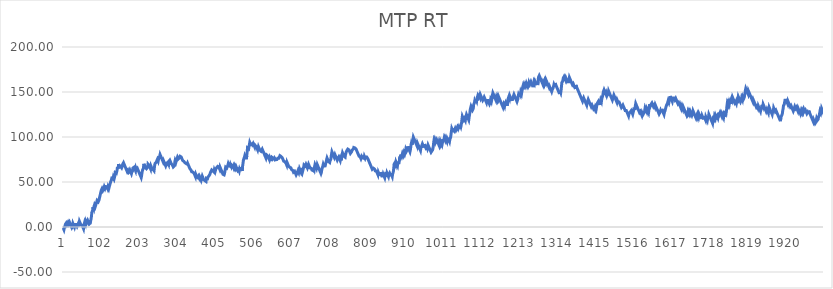
| Category | MTP RT |
|---|---|
| 0 | -1 |
| 1 | -2 |
| 2 | -3 |
| 3 | -1.1 |
| 4 | -2.1 |
| 5 | 1.43 |
| 6 | 3.15 |
| 7 | 2.15 |
| 8 | 4.4 |
| 9 | 3.4 |
| 10 | 2.4 |
| 11 | 1.4 |
| 12 | 3.46 |
| 13 | 5.176 |
| 14 | 4.176 |
| 15 | 3.176 |
| 16 | 2.176 |
| 17 | 5.216 |
| 18 | 4.216 |
| 19 | 3.216 |
| 20 | 2.216 |
| 21 | 1.216 |
| 22 | 0.216 |
| 23 | -0.784 |
| 24 | -1.784 |
| 25 | 0.616 |
| 26 | 3.756 |
| 27 | 2.756 |
| 28 | 1.756 |
| 29 | 0.756 |
| 30 | -0.244 |
| 31 | 1.386 |
| 32 | 2.816 |
| 33 | 1.816 |
| 34 | 3.756 |
| 35 | 2.756 |
| 36 | 1.756 |
| 37 | 0.756 |
| 38 | -0.244 |
| 39 | 2.696 |
| 40 | 1.696 |
| 41 | 0.696 |
| 42 | 4.126 |
| 43 | 6.376 |
| 44 | 5.376 |
| 45 | 4.376 |
| 46 | 3.376 |
| 47 | 2.376 |
| 48 | 1.376 |
| 49 | 3.046 |
| 50 | 2.046 |
| 51 | 1.046 |
| 52 | 0.046 |
| 53 | -0.954 |
| 54 | -1.954 |
| 55 | 0.936 |
| 56 | 3.676 |
| 57 | 5.326 |
| 58 | 4.326 |
| 59 | 3.326 |
| 60 | 6.266 |
| 61 | 5.266 |
| 62 | 4.266 |
| 63 | 3.266 |
| 64 | 4.656 |
| 65 | 7.256 |
| 66 | 6.256 |
| 67 | 5.256 |
| 68 | 4.256 |
| 69 | 3.256 |
| 70 | 3.666 |
| 71 | 2.666 |
| 72 | 4.336 |
| 73 | 6.986 |
| 74 | 9.186 |
| 75 | 11.876 |
| 76 | 16.186 |
| 77 | 15.186 |
| 78 | 18.326 |
| 79 | 22.146 |
| 80 | 21.146 |
| 81 | 20.146 |
| 82 | 23.186 |
| 83 | 24.516 |
| 84 | 23.516 |
| 85 | 22.516 |
| 86 | 23.576 |
| 87 | 25.246 |
| 88 | 26.426 |
| 89 | 25.426 |
| 90 | 29.446 |
| 91 | 30.006 |
| 92 | 29.006 |
| 93 | 28.006 |
| 94 | 27.006 |
| 95 | 29.946 |
| 96 | 31.786 |
| 97 | 32.426 |
| 98 | 35.366 |
| 99 | 36.036 |
| 100 | 35.036 |
| 101 | 40.716 |
| 102 | 39.716 |
| 103 | 42.556 |
| 104 | 41.556 |
| 105 | 40.556 |
| 106 | 39.556 |
| 107 | 41.226 |
| 108 | 43.186 |
| 109 | 44.656 |
| 110 | 43.656 |
| 111 | 42.656 |
| 112 | 41.656 |
| 113 | 44.886 |
| 114 | 43.886 |
| 115 | 45.786 |
| 116 | 44.786 |
| 117 | 43.786 |
| 118 | 42.786 |
| 119 | 44.666 |
| 120 | 43.666 |
| 121 | 42.666 |
| 122 | 41.666 |
| 123 | 45.786 |
| 124 | 44.786 |
| 125 | 46.416 |
| 126 | 50.236 |
| 127 | 51.196 |
| 128 | 52.466 |
| 129 | 54.096 |
| 130 | 53.096 |
| 131 | 54.326 |
| 132 | 53.326 |
| 133 | 55.336 |
| 134 | 54.336 |
| 135 | 53.336 |
| 136 | 55.026 |
| 137 | 56.716 |
| 138 | 60.436 |
| 139 | 59.436 |
| 140 | 60.636 |
| 141 | 59.636 |
| 142 | 58.636 |
| 143 | 63.246 |
| 144 | 66.776 |
| 145 | 65.776 |
| 146 | 64.776 |
| 147 | 69.876 |
| 148 | 68.876 |
| 149 | 67.876 |
| 150 | 66.876 |
| 151 | 68.346 |
| 152 | 67.346 |
| 153 | 67.646 |
| 154 | 66.646 |
| 155 | 65.646 |
| 156 | 66.766 |
| 157 | 67.846 |
| 158 | 69.856 |
| 159 | 68.856 |
| 160 | 71.406 |
| 161 | 70.406 |
| 162 | 69.406 |
| 163 | 68.406 |
| 164 | 67.406 |
| 165 | 66.406 |
| 166 | 65.406 |
| 167 | 64.406 |
| 168 | 63.406 |
| 169 | 62.406 |
| 170 | 61.406 |
| 171 | 60.406 |
| 172 | 62.906 |
| 173 | 61.906 |
| 174 | 60.906 |
| 175 | 59.906 |
| 176 | 62.066 |
| 177 | 63.226 |
| 178 | 62.226 |
| 179 | 61.226 |
| 180 | 60.226 |
| 181 | 59.226 |
| 182 | 60.856 |
| 183 | 61.156 |
| 184 | 62.126 |
| 185 | 65.556 |
| 186 | 64.556 |
| 187 | 65.636 |
| 188 | 66.436 |
| 189 | 65.436 |
| 190 | 64.436 |
| 191 | 63.436 |
| 192 | 62.436 |
| 193 | 65.576 |
| 194 | 64.576 |
| 195 | 63.576 |
| 196 | 62.576 |
| 197 | 64.876 |
| 198 | 63.876 |
| 199 | 62.876 |
| 200 | 61.876 |
| 201 | 60.876 |
| 202 | 59.876 |
| 203 | 58.876 |
| 204 | 57.876 |
| 205 | 56.876 |
| 206 | 55.876 |
| 207 | 54.876 |
| 208 | 56.836 |
| 209 | 60.066 |
| 210 | 62.176 |
| 211 | 63.606 |
| 212 | 62.606 |
| 213 | 65.256 |
| 214 | 70.156 |
| 215 | 69.156 |
| 216 | 68.156 |
| 217 | 67.156 |
| 218 | 66.156 |
| 219 | 66.806 |
| 220 | 65.806 |
| 221 | 64.806 |
| 222 | 63.806 |
| 223 | 64.416 |
| 224 | 66.476 |
| 225 | 69.906 |
| 226 | 68.906 |
| 227 | 69.406 |
| 228 | 68.406 |
| 229 | 67.406 |
| 230 | 66.406 |
| 231 | 65.406 |
| 232 | 64.406 |
| 233 | 67.546 |
| 234 | 66.546 |
| 235 | 65.546 |
| 236 | 64.546 |
| 237 | 65.206 |
| 238 | 64.206 |
| 239 | 63.206 |
| 240 | 63.556 |
| 241 | 62.556 |
| 242 | 66.086 |
| 243 | 69.316 |
| 244 | 70.786 |
| 245 | 71.406 |
| 246 | 70.406 |
| 247 | 72.096 |
| 248 | 72.566 |
| 249 | 71.566 |
| 250 | 75.196 |
| 251 | 74.196 |
| 252 | 73.196 |
| 253 | 72.196 |
| 254 | 77.296 |
| 255 | 76.296 |
| 256 | 78.596 |
| 257 | 80.516 |
| 258 | 79.516 |
| 259 | 78.516 |
| 260 | 77.516 |
| 261 | 76.516 |
| 262 | 75.516 |
| 263 | 74.516 |
| 264 | 73.516 |
| 265 | 72.516 |
| 266 | 73.866 |
| 267 | 72.866 |
| 268 | 71.866 |
| 269 | 70.866 |
| 270 | 69.866 |
| 271 | 68.866 |
| 272 | 67.866 |
| 273 | 69.026 |
| 274 | 72.456 |
| 275 | 71.456 |
| 276 | 70.456 |
| 277 | 69.456 |
| 278 | 71.706 |
| 279 | 70.706 |
| 280 | 69.706 |
| 281 | 72.936 |
| 282 | 73.296 |
| 283 | 74.136 |
| 284 | 73.136 |
| 285 | 72.136 |
| 286 | 71.136 |
| 287 | 70.136 |
| 288 | 69.136 |
| 289 | 69.656 |
| 290 | 68.656 |
| 291 | 67.656 |
| 292 | 66.656 |
| 293 | 65.656 |
| 294 | 66.856 |
| 295 | 67.776 |
| 296 | 71.986 |
| 297 | 73.946 |
| 298 | 72.946 |
| 299 | 71.946 |
| 300 | 70.946 |
| 301 | 74.966 |
| 302 | 73.966 |
| 303 | 77.396 |
| 304 | 76.396 |
| 305 | 75.396 |
| 306 | 74.396 |
| 307 | 74.896 |
| 308 | 76.636 |
| 309 | 77.636 |
| 310 | 78.616 |
| 311 | 77.616 |
| 312 | 78.906 |
| 313 | 77.906 |
| 314 | 76.906 |
| 315 | 75.906 |
| 316 | 74.906 |
| 317 | 73.906 |
| 318 | 72.906 |
| 319 | 73.966 |
| 320 | 72.966 |
| 321 | 71.966 |
| 322 | 72.446 |
| 323 | 71.446 |
| 324 | 72.526 |
| 325 | 71.526 |
| 326 | 70.526 |
| 327 | 69.526 |
| 328 | 70.796 |
| 329 | 69.796 |
| 330 | 70.956 |
| 331 | 69.956 |
| 332 | 68.956 |
| 333 | 67.956 |
| 334 | 66.956 |
| 335 | 65.956 |
| 336 | 64.956 |
| 337 | 63.956 |
| 338 | 64.336 |
| 339 | 63.336 |
| 340 | 62.336 |
| 341 | 61.336 |
| 342 | 60.336 |
| 343 | 62.056 |
| 344 | 61.056 |
| 345 | 61.846 |
| 346 | 60.846 |
| 347 | 59.846 |
| 348 | 58.846 |
| 349 | 57.846 |
| 350 | 56.846 |
| 351 | 55.846 |
| 352 | 58.396 |
| 353 | 57.396 |
| 354 | 56.396 |
| 355 | 55.396 |
| 356 | 56.026 |
| 357 | 55.026 |
| 358 | 54.026 |
| 359 | 56.526 |
| 360 | 55.526 |
| 361 | 54.526 |
| 362 | 55.876 |
| 363 | 54.876 |
| 364 | 53.876 |
| 365 | 52.876 |
| 366 | 51.876 |
| 367 | 52.216 |
| 368 | 51.216 |
| 369 | 56.506 |
| 370 | 55.506 |
| 371 | 54.506 |
| 372 | 53.506 |
| 373 | 52.506 |
| 374 | 53.466 |
| 375 | 52.466 |
| 376 | 51.466 |
| 377 | 50.466 |
| 378 | 51.566 |
| 379 | 50.566 |
| 380 | 54.196 |
| 381 | 53.196 |
| 382 | 54.746 |
| 383 | 53.746 |
| 384 | 55.256 |
| 385 | 54.256 |
| 386 | 56.076 |
| 387 | 57.026 |
| 388 | 56.026 |
| 389 | 58.426 |
| 390 | 59.166 |
| 391 | 60.906 |
| 392 | 61.206 |
| 393 | 60.206 |
| 394 | 63.436 |
| 395 | 64.346 |
| 396 | 63.346 |
| 397 | 62.346 |
| 398 | 61.346 |
| 399 | 62.096 |
| 400 | 61.096 |
| 401 | 63.396 |
| 402 | 62.396 |
| 403 | 61.396 |
| 404 | 62.866 |
| 405 | 64.456 |
| 406 | 63.456 |
| 407 | 65.756 |
| 408 | 66.736 |
| 409 | 65.736 |
| 410 | 67.346 |
| 411 | 66.346 |
| 412 | 67.426 |
| 413 | 66.426 |
| 414 | 65.426 |
| 415 | 64.426 |
| 416 | 66.586 |
| 417 | 65.586 |
| 418 | 64.586 |
| 419 | 63.586 |
| 420 | 62.586 |
| 421 | 61.586 |
| 422 | 60.586 |
| 423 | 59.586 |
| 424 | 58.586 |
| 425 | 57.586 |
| 426 | 58.936 |
| 427 | 57.936 |
| 428 | 59.366 |
| 429 | 58.366 |
| 430 | 59.776 |
| 431 | 66.436 |
| 432 | 67.406 |
| 433 | 66.406 |
| 434 | 65.406 |
| 435 | 64.406 |
| 436 | 65.936 |
| 437 | 68.776 |
| 438 | 70.406 |
| 439 | 69.406 |
| 440 | 68.406 |
| 441 | 69.446 |
| 442 | 68.446 |
| 443 | 67.446 |
| 444 | 69.406 |
| 445 | 68.406 |
| 446 | 67.406 |
| 447 | 69.016 |
| 448 | 68.016 |
| 449 | 68.946 |
| 450 | 67.946 |
| 451 | 66.946 |
| 452 | 65.946 |
| 453 | 67.636 |
| 454 | 66.636 |
| 455 | 65.636 |
| 456 | 67.596 |
| 457 | 66.596 |
| 458 | 65.596 |
| 459 | 66.846 |
| 460 | 65.846 |
| 461 | 64.846 |
| 462 | 63.846 |
| 463 | 62.846 |
| 464 | 61.846 |
| 465 | 64.006 |
| 466 | 63.006 |
| 467 | 62.006 |
| 468 | 64.206 |
| 469 | 63.206 |
| 470 | 62.206 |
| 471 | 66.326 |
| 472 | 65.326 |
| 473 | 64.326 |
| 474 | 63.326 |
| 475 | 62.326 |
| 476 | 67.616 |
| 477 | 70.506 |
| 478 | 73.736 |
| 479 | 75.496 |
| 480 | 74.496 |
| 481 | 77.636 |
| 482 | 79.356 |
| 483 | 78.356 |
| 484 | 77.356 |
| 485 | 76.356 |
| 486 | 75.356 |
| 487 | 79.176 |
| 488 | 82.996 |
| 489 | 87.896 |
| 490 | 86.896 |
| 491 | 87.936 |
| 492 | 86.936 |
| 493 | 89.776 |
| 494 | 91.576 |
| 495 | 93.976 |
| 496 | 92.976 |
| 497 | 91.976 |
| 498 | 90.976 |
| 499 | 89.976 |
| 500 | 93.606 |
| 501 | 92.606 |
| 502 | 91.606 |
| 503 | 90.606 |
| 504 | 93.006 |
| 505 | 92.006 |
| 506 | 91.006 |
| 507 | 90.006 |
| 508 | 89.006 |
| 509 | 90.926 |
| 510 | 91.596 |
| 511 | 90.596 |
| 512 | 89.596 |
| 513 | 88.596 |
| 514 | 87.596 |
| 515 | 86.596 |
| 516 | 85.596 |
| 517 | 86.696 |
| 518 | 89.196 |
| 519 | 88.196 |
| 520 | 87.196 |
| 521 | 86.196 |
| 522 | 85.196 |
| 523 | 86.106 |
| 524 | 85.106 |
| 525 | 84.106 |
| 526 | 83.106 |
| 527 | 83.856 |
| 528 | 86.546 |
| 529 | 85.546 |
| 530 | 84.546 |
| 531 | 83.546 |
| 532 | 82.546 |
| 533 | 81.546 |
| 534 | 80.546 |
| 535 | 79.546 |
| 536 | 78.546 |
| 537 | 77.546 |
| 538 | 76.546 |
| 539 | 77.436 |
| 540 | 80.036 |
| 541 | 80.946 |
| 542 | 79.946 |
| 543 | 78.946 |
| 544 | 77.946 |
| 545 | 76.946 |
| 546 | 75.946 |
| 547 | 74.946 |
| 548 | 76.886 |
| 549 | 75.886 |
| 550 | 74.886 |
| 551 | 73.886 |
| 552 | 75.706 |
| 553 | 74.706 |
| 554 | 77.446 |
| 555 | 76.446 |
| 556 | 77.486 |
| 557 | 76.486 |
| 558 | 77.296 |
| 559 | 76.296 |
| 560 | 75.296 |
| 561 | 76.526 |
| 562 | 75.526 |
| 563 | 75.726 |
| 564 | 74.726 |
| 565 | 75.326 |
| 566 | 74.326 |
| 567 | 74.986 |
| 568 | 73.986 |
| 569 | 76.286 |
| 570 | 75.286 |
| 571 | 75.486 |
| 572 | 76.326 |
| 573 | 75.326 |
| 574 | 77.146 |
| 575 | 79.256 |
| 576 | 78.256 |
| 577 | 79.356 |
| 578 | 78.356 |
| 579 | 77.356 |
| 580 | 78.156 |
| 581 | 77.156 |
| 582 | 76.156 |
| 583 | 75.156 |
| 584 | 74.156 |
| 585 | 73.156 |
| 586 | 72.156 |
| 587 | 73.546 |
| 588 | 72.546 |
| 589 | 71.546 |
| 590 | 71.786 |
| 591 | 70.786 |
| 592 | 69.786 |
| 593 | 68.786 |
| 594 | 71.726 |
| 595 | 70.726 |
| 596 | 69.726 |
| 597 | 68.726 |
| 598 | 67.726 |
| 599 | 68.316 |
| 600 | 67.316 |
| 601 | 66.316 |
| 602 | 65.316 |
| 603 | 66.766 |
| 604 | 65.766 |
| 605 | 64.766 |
| 606 | 63.766 |
| 607 | 62.766 |
| 608 | 63.886 |
| 609 | 62.886 |
| 610 | 61.886 |
| 611 | 60.886 |
| 612 | 61.636 |
| 613 | 60.636 |
| 614 | 61.926 |
| 615 | 60.926 |
| 616 | 59.926 |
| 617 | 58.926 |
| 618 | 57.926 |
| 619 | 56.926 |
| 620 | 58.156 |
| 621 | 60.406 |
| 622 | 59.406 |
| 623 | 62.636 |
| 624 | 61.636 |
| 625 | 60.636 |
| 626 | 59.636 |
| 627 | 64.736 |
| 628 | 63.736 |
| 629 | 62.736 |
| 630 | 61.736 |
| 631 | 60.736 |
| 632 | 61.896 |
| 633 | 60.896 |
| 634 | 59.896 |
| 635 | 60.286 |
| 636 | 63.176 |
| 637 | 62.176 |
| 638 | 66.486 |
| 639 | 68.986 |
| 640 | 67.986 |
| 641 | 68.756 |
| 642 | 67.756 |
| 643 | 66.756 |
| 644 | 69.646 |
| 645 | 68.646 |
| 646 | 67.646 |
| 647 | 66.646 |
| 648 | 65.646 |
| 649 | 64.646 |
| 650 | 68.076 |
| 651 | 69.566 |
| 652 | 68.566 |
| 653 | 67.566 |
| 654 | 66.566 |
| 655 | 65.566 |
| 656 | 64.566 |
| 657 | 66.286 |
| 658 | 65.286 |
| 659 | 64.286 |
| 660 | 63.286 |
| 661 | 62.286 |
| 662 | 63.596 |
| 663 | 62.596 |
| 664 | 65.926 |
| 665 | 64.926 |
| 666 | 63.926 |
| 667 | 67.156 |
| 668 | 69.266 |
| 669 | 68.266 |
| 670 | 67.266 |
| 671 | 66.266 |
| 672 | 65.266 |
| 673 | 64.266 |
| 674 | 69.366 |
| 675 | 68.366 |
| 676 | 67.366 |
| 677 | 66.366 |
| 678 | 65.366 |
| 679 | 64.366 |
| 680 | 63.366 |
| 681 | 62.366 |
| 682 | 61.366 |
| 683 | 60.366 |
| 684 | 59.366 |
| 685 | 60.546 |
| 686 | 63.686 |
| 687 | 64.196 |
| 688 | 66.496 |
| 689 | 67.986 |
| 690 | 69.766 |
| 691 | 68.766 |
| 692 | 67.766 |
| 693 | 66.766 |
| 694 | 68.876 |
| 695 | 67.876 |
| 696 | 66.876 |
| 697 | 71.286 |
| 698 | 72.876 |
| 699 | 75.076 |
| 700 | 76.706 |
| 701 | 75.706 |
| 702 | 74.706 |
| 703 | 73.706 |
| 704 | 72.706 |
| 705 | 71.706 |
| 706 | 72.686 |
| 707 | 71.686 |
| 708 | 73.646 |
| 709 | 72.646 |
| 710 | 75.336 |
| 711 | 78.476 |
| 712 | 81.076 |
| 713 | 83.576 |
| 714 | 82.576 |
| 715 | 81.576 |
| 716 | 80.576 |
| 717 | 79.576 |
| 718 | 78.576 |
| 719 | 77.576 |
| 720 | 79.086 |
| 721 | 80.396 |
| 722 | 79.396 |
| 723 | 78.396 |
| 724 | 77.396 |
| 725 | 76.396 |
| 726 | 75.396 |
| 727 | 74.396 |
| 728 | 73.396 |
| 729 | 76.436 |
| 730 | 75.436 |
| 731 | 77.836 |
| 732 | 76.836 |
| 733 | 75.836 |
| 734 | 74.836 |
| 735 | 73.836 |
| 736 | 76.036 |
| 737 | 75.036 |
| 738 | 74.036 |
| 739 | 79.326 |
| 740 | 80.556 |
| 741 | 82.476 |
| 742 | 81.476 |
| 743 | 80.476 |
| 744 | 79.476 |
| 745 | 78.476 |
| 746 | 77.476 |
| 747 | 78.516 |
| 748 | 77.516 |
| 749 | 80.406 |
| 750 | 81.896 |
| 751 | 83.426 |
| 752 | 83.696 |
| 753 | 85.166 |
| 754 | 84.166 |
| 755 | 86.566 |
| 756 | 85.566 |
| 757 | 86.766 |
| 758 | 85.766 |
| 759 | 84.766 |
| 760 | 83.766 |
| 761 | 82.766 |
| 762 | 81.766 |
| 763 | 80.766 |
| 764 | 82.156 |
| 765 | 83.506 |
| 766 | 84.376 |
| 767 | 85.686 |
| 768 | 86.706 |
| 769 | 85.706 |
| 770 | 86.766 |
| 771 | 88.316 |
| 772 | 87.316 |
| 773 | 88.886 |
| 774 | 87.886 |
| 775 | 88.596 |
| 776 | 87.596 |
| 777 | 86.596 |
| 778 | 85.596 |
| 779 | 84.596 |
| 780 | 83.596 |
| 781 | 82.596 |
| 782 | 81.596 |
| 783 | 80.596 |
| 784 | 79.596 |
| 785 | 78.596 |
| 786 | 77.596 |
| 787 | 78.946 |
| 788 | 77.946 |
| 789 | 76.946 |
| 790 | 75.946 |
| 791 | 77.086 |
| 792 | 78.596 |
| 793 | 77.596 |
| 794 | 77.796 |
| 795 | 76.796 |
| 796 | 75.796 |
| 797 | 77.286 |
| 798 | 76.286 |
| 799 | 78.536 |
| 800 | 77.536 |
| 801 | 76.536 |
| 802 | 77.786 |
| 803 | 76.786 |
| 804 | 78.896 |
| 805 | 77.896 |
| 806 | 76.896 |
| 807 | 77.146 |
| 808 | 76.146 |
| 809 | 75.146 |
| 810 | 74.146 |
| 811 | 73.146 |
| 812 | 72.146 |
| 813 | 71.146 |
| 814 | 70.146 |
| 815 | 69.146 |
| 816 | 68.146 |
| 817 | 67.146 |
| 818 | 66.146 |
| 819 | 65.146 |
| 820 | 64.146 |
| 821 | 63.146 |
| 822 | 64.376 |
| 823 | 65.306 |
| 824 | 66.326 |
| 825 | 65.326 |
| 826 | 64.326 |
| 827 | 63.326 |
| 828 | 62.326 |
| 829 | 61.326 |
| 830 | 63.126 |
| 831 | 62.126 |
| 832 | 61.126 |
| 833 | 60.126 |
| 834 | 59.126 |
| 835 | 58.126 |
| 836 | 60.916 |
| 837 | 59.916 |
| 838 | 58.916 |
| 839 | 57.916 |
| 840 | 56.916 |
| 841 | 60.736 |
| 842 | 59.736 |
| 843 | 58.736 |
| 844 | 57.736 |
| 845 | 56.736 |
| 846 | 57.656 |
| 847 | 57.816 |
| 848 | 56.816 |
| 849 | 58.736 |
| 850 | 57.736 |
| 851 | 56.736 |
| 852 | 55.736 |
| 853 | 54.736 |
| 854 | 57.036 |
| 855 | 58.746 |
| 856 | 57.746 |
| 857 | 58.666 |
| 858 | 57.666 |
| 859 | 60.066 |
| 860 | 59.066 |
| 861 | 58.066 |
| 862 | 57.066 |
| 863 | 56.066 |
| 864 | 58.176 |
| 865 | 57.176 |
| 866 | 59.866 |
| 867 | 58.866 |
| 868 | 57.866 |
| 869 | 56.866 |
| 870 | 58.976 |
| 871 | 57.976 |
| 872 | 56.976 |
| 873 | 55.976 |
| 874 | 58.916 |
| 875 | 57.916 |
| 876 | 61.546 |
| 877 | 65.366 |
| 878 | 69.876 |
| 879 | 68.876 |
| 880 | 71.276 |
| 881 | 70.276 |
| 882 | 69.276 |
| 883 | 72.316 |
| 884 | 71.316 |
| 885 | 70.316 |
| 886 | 69.316 |
| 887 | 68.316 |
| 888 | 71.356 |
| 889 | 70.356 |
| 890 | 72.366 |
| 891 | 71.366 |
| 892 | 73.866 |
| 893 | 78.376 |
| 894 | 77.376 |
| 895 | 76.376 |
| 896 | 80.396 |
| 897 | 79.396 |
| 898 | 78.396 |
| 899 | 77.396 |
| 900 | 81.606 |
| 901 | 80.606 |
| 902 | 79.606 |
| 903 | 78.606 |
| 904 | 82.816 |
| 905 | 81.816 |
| 906 | 80.816 |
| 907 | 79.816 |
| 908 | 83.736 |
| 909 | 86.286 |
| 910 | 85.286 |
| 911 | 84.286 |
| 912 | 83.286 |
| 913 | 85.936 |
| 914 | 89.566 |
| 915 | 88.566 |
| 916 | 87.566 |
| 917 | 86.566 |
| 918 | 85.566 |
| 919 | 84.566 |
| 920 | 83.566 |
| 921 | 85.526 |
| 922 | 88.416 |
| 923 | 91.456 |
| 924 | 93.471 |
| 925 | 92.471 |
| 926 | 91.471 |
| 927 | 95.101 |
| 928 | 97.211 |
| 929 | 99.861 |
| 930 | 98.861 |
| 931 | 97.861 |
| 932 | 96.861 |
| 933 | 95.861 |
| 934 | 94.861 |
| 935 | 93.861 |
| 936 | 92.861 |
| 937 | 91.861 |
| 938 | 90.861 |
| 939 | 89.861 |
| 940 | 93.001 |
| 941 | 92.001 |
| 942 | 91.001 |
| 943 | 90.001 |
| 944 | 89.001 |
| 945 | 88.001 |
| 946 | 87.001 |
| 947 | 86.001 |
| 948 | 85.001 |
| 949 | 87.691 |
| 950 | 86.691 |
| 951 | 90.021 |
| 952 | 89.021 |
| 953 | 92.351 |
| 954 | 91.351 |
| 955 | 90.351 |
| 956 | 89.351 |
| 957 | 88.351 |
| 958 | 91.981 |
| 959 | 90.981 |
| 960 | 89.981 |
| 961 | 88.981 |
| 962 | 87.981 |
| 963 | 86.981 |
| 964 | 89.141 |
| 965 | 88.141 |
| 966 | 87.141 |
| 967 | 86.141 |
| 968 | 91.041 |
| 969 | 90.041 |
| 970 | 89.041 |
| 971 | 88.041 |
| 972 | 87.041 |
| 973 | 86.041 |
| 974 | 85.041 |
| 975 | 84.041 |
| 976 | 83.041 |
| 977 | 82.041 |
| 978 | 84.341 |
| 979 | 83.341 |
| 980 | 85.541 |
| 981 | 87.601 |
| 982 | 89.711 |
| 983 | 94.221 |
| 984 | 96.721 |
| 985 | 95.721 |
| 986 | 94.721 |
| 987 | 97.021 |
| 988 | 96.021 |
| 989 | 95.021 |
| 990 | 94.021 |
| 991 | 96.961 |
| 992 | 95.961 |
| 993 | 94.961 |
| 994 | 93.961 |
| 995 | 92.961 |
| 996 | 91.961 |
| 997 | 90.961 |
| 998 | 94.101 |
| 999 | 93.101 |
| 1000 | 92.101 |
| 1001 | 95.141 |
| 1002 | 94.141 |
| 1003 | 93.141 |
| 1004 | 92.141 |
| 1005 | 91.141 |
| 1006 | 93.101 |
| 1007 | 96.331 |
| 1008 | 95.331 |
| 1009 | 97.341 |
| 1010 | 96.341 |
| 1011 | 98.741 |
| 1012 | 97.741 |
| 1013 | 96.741 |
| 1014 | 98.991 |
| 1015 | 97.991 |
| 1016 | 96.991 |
| 1017 | 95.991 |
| 1018 | 94.991 |
| 1019 | 97.831 |
| 1020 | 96.831 |
| 1021 | 95.831 |
| 1022 | 94.831 |
| 1023 | 96.991 |
| 1024 | 95.991 |
| 1025 | 94.991 |
| 1026 | 97.441 |
| 1027 | 96.441 |
| 1028 | 99.871 |
| 1029 | 103.301 |
| 1030 | 106.241 |
| 1031 | 109.381 |
| 1032 | 108.381 |
| 1033 | 107.381 |
| 1034 | 106.381 |
| 1035 | 105.381 |
| 1036 | 109.501 |
| 1037 | 108.501 |
| 1038 | 107.501 |
| 1039 | 106.501 |
| 1040 | 109.541 |
| 1041 | 108.541 |
| 1042 | 107.541 |
| 1043 | 106.541 |
| 1044 | 109.331 |
| 1045 | 108.331 |
| 1046 | 111.171 |
| 1047 | 110.171 |
| 1048 | 109.171 |
| 1049 | 108.171 |
| 1050 | 111.401 |
| 1051 | 110.401 |
| 1052 | 109.401 |
| 1053 | 113.321 |
| 1054 | 112.321 |
| 1055 | 111.321 |
| 1056 | 113.281 |
| 1057 | 116.021 |
| 1058 | 119.741 |
| 1059 | 122.971 |
| 1060 | 121.971 |
| 1061 | 120.971 |
| 1062 | 119.971 |
| 1063 | 118.971 |
| 1064 | 117.971 |
| 1065 | 120.661 |
| 1066 | 119.661 |
| 1067 | 118.661 |
| 1068 | 121.501 |
| 1069 | 120.501 |
| 1070 | 124.911 |
| 1071 | 123.911 |
| 1072 | 122.911 |
| 1073 | 121.911 |
| 1074 | 120.911 |
| 1075 | 119.911 |
| 1076 | 118.911 |
| 1077 | 121.951 |
| 1078 | 124.641 |
| 1079 | 126.841 |
| 1080 | 130.661 |
| 1081 | 129.661 |
| 1082 | 133.971 |
| 1083 | 132.971 |
| 1084 | 131.971 |
| 1085 | 130.971 |
| 1086 | 129.971 |
| 1087 | 128.971 |
| 1088 | 131.711 |
| 1089 | 136.021 |
| 1090 | 135.021 |
| 1091 | 137.961 |
| 1092 | 140.311 |
| 1093 | 139.311 |
| 1094 | 138.311 |
| 1095 | 142.131 |
| 1096 | 141.131 |
| 1097 | 140.131 |
| 1098 | 143.361 |
| 1099 | 142.361 |
| 1100 | 145.991 |
| 1101 | 144.991 |
| 1102 | 143.991 |
| 1103 | 142.991 |
| 1104 | 145.931 |
| 1105 | 144.931 |
| 1106 | 143.931 |
| 1107 | 146.771 |
| 1108 | 145.771 |
| 1109 | 144.771 |
| 1110 | 143.771 |
| 1111 | 142.771 |
| 1112 | 141.771 |
| 1113 | 140.771 |
| 1114 | 139.771 |
| 1115 | 142.221 |
| 1116 | 141.221 |
| 1117 | 144.261 |
| 1118 | 143.261 |
| 1119 | 142.261 |
| 1120 | 141.261 |
| 1121 | 140.261 |
| 1122 | 139.261 |
| 1123 | 138.261 |
| 1124 | 140.461 |
| 1125 | 139.461 |
| 1126 | 141.571 |
| 1127 | 140.571 |
| 1128 | 139.571 |
| 1129 | 138.571 |
| 1130 | 137.571 |
| 1131 | 136.571 |
| 1132 | 135.571 |
| 1133 | 138.611 |
| 1134 | 141.261 |
| 1135 | 140.261 |
| 1136 | 139.261 |
| 1137 | 141.371 |
| 1138 | 144.311 |
| 1139 | 146.861 |
| 1140 | 148.921 |
| 1141 | 147.921 |
| 1142 | 146.921 |
| 1143 | 145.921 |
| 1144 | 144.921 |
| 1145 | 143.921 |
| 1146 | 142.921 |
| 1147 | 141.921 |
| 1148 | 140.921 |
| 1149 | 143.321 |
| 1150 | 142.321 |
| 1151 | 141.321 |
| 1152 | 144.361 |
| 1153 | 143.361 |
| 1154 | 142.361 |
| 1155 | 144.961 |
| 1156 | 143.961 |
| 1157 | 142.961 |
| 1158 | 141.961 |
| 1159 | 140.961 |
| 1160 | 139.961 |
| 1161 | 138.961 |
| 1162 | 137.961 |
| 1163 | 136.961 |
| 1164 | 135.961 |
| 1165 | 134.961 |
| 1166 | 133.961 |
| 1167 | 132.961 |
| 1168 | 131.961 |
| 1169 | 136.271 |
| 1170 | 135.271 |
| 1171 | 134.271 |
| 1172 | 136.961 |
| 1173 | 135.961 |
| 1174 | 138.701 |
| 1175 | 137.701 |
| 1176 | 136.701 |
| 1177 | 135.701 |
| 1178 | 134.701 |
| 1179 | 138.331 |
| 1180 | 142.051 |
| 1181 | 141.051 |
| 1182 | 144.381 |
| 1183 | 143.381 |
| 1184 | 142.381 |
| 1185 | 145.521 |
| 1186 | 144.521 |
| 1187 | 143.521 |
| 1188 | 142.521 |
| 1189 | 141.521 |
| 1190 | 140.521 |
| 1191 | 142.581 |
| 1192 | 141.581 |
| 1193 | 140.581 |
| 1194 | 144.601 |
| 1195 | 143.601 |
| 1196 | 147.231 |
| 1197 | 146.231 |
| 1198 | 145.231 |
| 1199 | 144.231 |
| 1200 | 143.231 |
| 1201 | 142.231 |
| 1202 | 141.231 |
| 1203 | 140.231 |
| 1204 | 139.231 |
| 1205 | 138.231 |
| 1206 | 141.761 |
| 1207 | 144.801 |
| 1208 | 146.861 |
| 1209 | 145.861 |
| 1210 | 144.861 |
| 1211 | 149.171 |
| 1212 | 148.171 |
| 1213 | 147.171 |
| 1214 | 150.111 |
| 1215 | 149.111 |
| 1216 | 148.111 |
| 1217 | 150.661 |
| 1218 | 152.671 |
| 1219 | 155.411 |
| 1220 | 154.411 |
| 1221 | 158.331 |
| 1222 | 157.331 |
| 1223 | 156.331 |
| 1224 | 155.331 |
| 1225 | 158.561 |
| 1226 | 157.561 |
| 1227 | 156.561 |
| 1228 | 155.561 |
| 1229 | 159.771 |
| 1230 | 158.771 |
| 1231 | 157.771 |
| 1232 | 156.771 |
| 1233 | 155.771 |
| 1234 | 154.771 |
| 1235 | 157.811 |
| 1236 | 160.461 |
| 1237 | 159.461 |
| 1238 | 158.461 |
| 1239 | 157.461 |
| 1240 | 159.421 |
| 1241 | 161.431 |
| 1242 | 160.431 |
| 1243 | 159.431 |
| 1244 | 158.431 |
| 1245 | 157.431 |
| 1246 | 156.431 |
| 1247 | 155.431 |
| 1248 | 159.641 |
| 1249 | 161.651 |
| 1250 | 160.651 |
| 1251 | 159.651 |
| 1252 | 161.611 |
| 1253 | 160.611 |
| 1254 | 159.611 |
| 1255 | 158.611 |
| 1256 | 160.721 |
| 1257 | 159.721 |
| 1258 | 158.721 |
| 1259 | 157.721 |
| 1260 | 162.331 |
| 1261 | 166.351 |
| 1262 | 165.351 |
| 1263 | 168.191 |
| 1264 | 167.191 |
| 1265 | 166.191 |
| 1266 | 165.191 |
| 1267 | 164.191 |
| 1268 | 163.191 |
| 1269 | 162.191 |
| 1270 | 161.191 |
| 1271 | 160.191 |
| 1272 | 159.191 |
| 1273 | 158.191 |
| 1274 | 160.491 |
| 1275 | 159.491 |
| 1276 | 158.491 |
| 1277 | 157.491 |
| 1278 | 162.591 |
| 1279 | 161.591 |
| 1280 | 160.591 |
| 1281 | 163.281 |
| 1282 | 162.281 |
| 1283 | 161.281 |
| 1284 | 160.281 |
| 1285 | 159.281 |
| 1286 | 158.281 |
| 1287 | 157.281 |
| 1288 | 156.281 |
| 1289 | 155.281 |
| 1290 | 156.436 |
| 1291 | 155.436 |
| 1292 | 154.436 |
| 1293 | 153.436 |
| 1294 | 152.436 |
| 1295 | 151.436 |
| 1296 | 150.436 |
| 1297 | 149.436 |
| 1298 | 153.156 |
| 1299 | 152.156 |
| 1300 | 154.706 |
| 1301 | 153.706 |
| 1302 | 158.216 |
| 1303 | 157.216 |
| 1304 | 156.216 |
| 1305 | 159.846 |
| 1306 | 158.846 |
| 1307 | 157.846 |
| 1308 | 156.846 |
| 1309 | 155.846 |
| 1310 | 154.846 |
| 1311 | 153.846 |
| 1312 | 152.846 |
| 1313 | 151.846 |
| 1314 | 150.846 |
| 1315 | 149.846 |
| 1316 | 148.846 |
| 1317 | 147.846 |
| 1318 | 151.176 |
| 1319 | 150.176 |
| 1320 | 149.176 |
| 1321 | 152.116 |
| 1322 | 156.136 |
| 1323 | 160.546 |
| 1324 | 159.546 |
| 1325 | 161.746 |
| 1326 | 163.706 |
| 1327 | 165.716 |
| 1328 | 164.716 |
| 1329 | 167.216 |
| 1330 | 166.216 |
| 1331 | 165.216 |
| 1332 | 164.216 |
| 1333 | 163.216 |
| 1334 | 165.276 |
| 1335 | 164.276 |
| 1336 | 163.276 |
| 1337 | 162.276 |
| 1338 | 161.276 |
| 1339 | 160.276 |
| 1340 | 162.386 |
| 1341 | 161.386 |
| 1342 | 163.736 |
| 1343 | 166.136 |
| 1344 | 165.136 |
| 1345 | 164.136 |
| 1346 | 163.136 |
| 1347 | 162.136 |
| 1348 | 161.136 |
| 1349 | 160.136 |
| 1350 | 159.136 |
| 1351 | 158.136 |
| 1352 | 157.136 |
| 1353 | 159.336 |
| 1354 | 158.336 |
| 1355 | 157.336 |
| 1356 | 156.336 |
| 1357 | 155.336 |
| 1358 | 154.336 |
| 1359 | 153.336 |
| 1360 | 157.746 |
| 1361 | 156.746 |
| 1362 | 155.746 |
| 1363 | 154.746 |
| 1364 | 153.746 |
| 1365 | 152.746 |
| 1366 | 151.746 |
| 1367 | 150.746 |
| 1368 | 149.746 |
| 1369 | 148.746 |
| 1370 | 147.746 |
| 1371 | 146.746 |
| 1372 | 145.746 |
| 1373 | 144.746 |
| 1374 | 143.746 |
| 1375 | 142.746 |
| 1376 | 141.746 |
| 1377 | 140.746 |
| 1378 | 139.746 |
| 1379 | 138.746 |
| 1380 | 140.806 |
| 1381 | 143.356 |
| 1382 | 142.356 |
| 1383 | 141.356 |
| 1384 | 140.356 |
| 1385 | 139.356 |
| 1386 | 138.356 |
| 1387 | 137.356 |
| 1388 | 136.356 |
| 1389 | 135.356 |
| 1390 | 137.466 |
| 1391 | 136.466 |
| 1392 | 138.476 |
| 1393 | 141.706 |
| 1394 | 140.706 |
| 1395 | 139.706 |
| 1396 | 138.706 |
| 1397 | 137.706 |
| 1398 | 136.706 |
| 1399 | 135.706 |
| 1400 | 134.706 |
| 1401 | 133.706 |
| 1402 | 132.706 |
| 1403 | 135.356 |
| 1404 | 134.356 |
| 1405 | 133.356 |
| 1406 | 132.356 |
| 1407 | 131.356 |
| 1408 | 130.356 |
| 1409 | 132.706 |
| 1410 | 131.706 |
| 1411 | 130.706 |
| 1412 | 132.666 |
| 1413 | 131.666 |
| 1414 | 130.666 |
| 1415 | 133.016 |
| 1416 | 136.546 |
| 1417 | 135.546 |
| 1418 | 138.196 |
| 1419 | 137.196 |
| 1420 | 139.646 |
| 1421 | 138.646 |
| 1422 | 137.646 |
| 1423 | 136.646 |
| 1424 | 135.646 |
| 1425 | 139.366 |
| 1426 | 141.326 |
| 1427 | 140.326 |
| 1428 | 139.326 |
| 1429 | 142.366 |
| 1430 | 141.366 |
| 1431 | 143.376 |
| 1432 | 146.806 |
| 1433 | 150.036 |
| 1434 | 149.036 |
| 1435 | 152.466 |
| 1436 | 151.466 |
| 1437 | 150.466 |
| 1438 | 149.466 |
| 1439 | 148.466 |
| 1440 | 147.466 |
| 1441 | 146.466 |
| 1442 | 148.766 |
| 1443 | 147.766 |
| 1444 | 146.766 |
| 1445 | 145.766 |
| 1446 | 148.316 |
| 1447 | 151.056 |
| 1448 | 150.056 |
| 1449 | 149.056 |
| 1450 | 148.056 |
| 1451 | 147.056 |
| 1452 | 146.056 |
| 1453 | 145.056 |
| 1454 | 144.056 |
| 1455 | 143.056 |
| 1456 | 142.056 |
| 1457 | 141.056 |
| 1458 | 140.056 |
| 1459 | 143.776 |
| 1460 | 142.776 |
| 1461 | 146.596 |
| 1462 | 145.596 |
| 1463 | 144.596 |
| 1464 | 143.596 |
| 1465 | 142.596 |
| 1466 | 141.596 |
| 1467 | 140.596 |
| 1468 | 139.596 |
| 1469 | 138.596 |
| 1470 | 140.706 |
| 1471 | 139.706 |
| 1472 | 138.706 |
| 1473 | 137.706 |
| 1474 | 139.766 |
| 1475 | 138.766 |
| 1476 | 137.766 |
| 1477 | 136.766 |
| 1478 | 135.766 |
| 1479 | 134.766 |
| 1480 | 133.766 |
| 1481 | 132.766 |
| 1482 | 131.766 |
| 1483 | 133.926 |
| 1484 | 132.926 |
| 1485 | 135.426 |
| 1486 | 134.426 |
| 1487 | 133.426 |
| 1488 | 132.426 |
| 1489 | 131.426 |
| 1490 | 130.426 |
| 1491 | 129.426 |
| 1492 | 128.426 |
| 1493 | 130.436 |
| 1494 | 129.436 |
| 1495 | 128.436 |
| 1496 | 127.436 |
| 1497 | 126.436 |
| 1498 | 125.436 |
| 1499 | 124.436 |
| 1500 | 123.436 |
| 1501 | 125.496 |
| 1502 | 124.496 |
| 1503 | 126.946 |
| 1504 | 125.946 |
| 1505 | 128.106 |
| 1506 | 127.106 |
| 1507 | 129.266 |
| 1508 | 128.266 |
| 1509 | 127.266 |
| 1510 | 126.266 |
| 1511 | 125.266 |
| 1512 | 124.266 |
| 1513 | 128.776 |
| 1514 | 131.376 |
| 1515 | 130.376 |
| 1516 | 132.336 |
| 1517 | 131.336 |
| 1518 | 134.566 |
| 1519 | 137.166 |
| 1520 | 136.166 |
| 1521 | 135.166 |
| 1522 | 134.166 |
| 1523 | 133.166 |
| 1524 | 132.166 |
| 1525 | 131.166 |
| 1526 | 130.166 |
| 1527 | 129.166 |
| 1528 | 128.166 |
| 1529 | 127.166 |
| 1530 | 126.166 |
| 1531 | 128.326 |
| 1532 | 127.326 |
| 1533 | 126.326 |
| 1534 | 125.326 |
| 1535 | 124.326 |
| 1536 | 126.626 |
| 1537 | 125.626 |
| 1538 | 124.626 |
| 1539 | 123.626 |
| 1540 | 126.126 |
| 1541 | 125.126 |
| 1542 | 127.726 |
| 1543 | 129.926 |
| 1544 | 132.426 |
| 1545 | 131.426 |
| 1546 | 130.426 |
| 1547 | 129.426 |
| 1548 | 128.426 |
| 1549 | 131.026 |
| 1550 | 130.026 |
| 1551 | 129.026 |
| 1552 | 128.026 |
| 1553 | 127.026 |
| 1554 | 130.166 |
| 1555 | 132.616 |
| 1556 | 136.536 |
| 1557 | 135.536 |
| 1558 | 134.536 |
| 1559 | 133.536 |
| 1560 | 136.576 |
| 1561 | 135.576 |
| 1562 | 137.826 |
| 1563 | 136.826 |
| 1564 | 135.826 |
| 1565 | 134.826 |
| 1566 | 133.826 |
| 1567 | 132.826 |
| 1568 | 135.326 |
| 1569 | 134.326 |
| 1570 | 133.326 |
| 1571 | 135.526 |
| 1572 | 134.526 |
| 1573 | 133.526 |
| 1574 | 132.526 |
| 1575 | 131.526 |
| 1576 | 130.526 |
| 1577 | 129.526 |
| 1578 | 128.526 |
| 1579 | 127.526 |
| 1580 | 126.526 |
| 1581 | 125.526 |
| 1582 | 124.526 |
| 1583 | 127.076 |
| 1584 | 126.076 |
| 1585 | 129.606 |
| 1586 | 128.606 |
| 1587 | 127.606 |
| 1588 | 131.036 |
| 1589 | 130.036 |
| 1590 | 129.036 |
| 1591 | 128.036 |
| 1592 | 127.036 |
| 1593 | 126.036 |
| 1594 | 125.036 |
| 1595 | 127.196 |
| 1596 | 126.196 |
| 1597 | 129.526 |
| 1598 | 128.526 |
| 1599 | 132.936 |
| 1600 | 131.936 |
| 1601 | 135.756 |
| 1602 | 134.756 |
| 1603 | 137.206 |
| 1604 | 136.206 |
| 1605 | 140.226 |
| 1606 | 139.226 |
| 1607 | 138.226 |
| 1608 | 137.226 |
| 1609 | 141.926 |
| 1610 | 145.456 |
| 1611 | 144.456 |
| 1612 | 143.456 |
| 1613 | 142.456 |
| 1614 | 141.456 |
| 1615 | 140.456 |
| 1616 | 139.456 |
| 1617 | 138.456 |
| 1618 | 143.356 |
| 1619 | 142.356 |
| 1620 | 144.416 |
| 1621 | 143.416 |
| 1622 | 142.416 |
| 1623 | 141.416 |
| 1624 | 140.416 |
| 1625 | 142.966 |
| 1626 | 141.966 |
| 1627 | 140.966 |
| 1628 | 139.966 |
| 1629 | 138.966 |
| 1630 | 137.966 |
| 1631 | 136.966 |
| 1632 | 135.966 |
| 1633 | 138.126 |
| 1634 | 137.126 |
| 1635 | 136.126 |
| 1636 | 135.126 |
| 1637 | 134.126 |
| 1638 | 133.126 |
| 1639 | 132.126 |
| 1640 | 134.916 |
| 1641 | 133.916 |
| 1642 | 132.916 |
| 1643 | 131.916 |
| 1644 | 130.916 |
| 1645 | 133.466 |
| 1646 | 132.466 |
| 1647 | 131.466 |
| 1648 | 130.466 |
| 1649 | 129.466 |
| 1650 | 128.466 |
| 1651 | 127.466 |
| 1652 | 126.466 |
| 1653 | 125.466 |
| 1654 | 124.466 |
| 1655 | 123.466 |
| 1656 | 122.466 |
| 1657 | 125.066 |
| 1658 | 128.006 |
| 1659 | 127.006 |
| 1660 | 126.006 |
| 1661 | 128.206 |
| 1662 | 127.206 |
| 1663 | 126.206 |
| 1664 | 128.166 |
| 1665 | 127.166 |
| 1666 | 126.166 |
| 1667 | 125.166 |
| 1668 | 124.166 |
| 1669 | 123.166 |
| 1670 | 126.696 |
| 1671 | 128.996 |
| 1672 | 127.996 |
| 1673 | 126.996 |
| 1674 | 125.996 |
| 1675 | 124.996 |
| 1676 | 123.996 |
| 1677 | 122.996 |
| 1678 | 121.996 |
| 1679 | 120.996 |
| 1680 | 119.996 |
| 1681 | 123.626 |
| 1682 | 122.626 |
| 1683 | 121.626 |
| 1684 | 124.666 |
| 1685 | 123.666 |
| 1686 | 122.666 |
| 1687 | 125.356 |
| 1688 | 124.356 |
| 1689 | 123.356 |
| 1690 | 122.356 |
| 1691 | 121.356 |
| 1692 | 120.356 |
| 1693 | 122.366 |
| 1694 | 121.366 |
| 1695 | 123.666 |
| 1696 | 122.666 |
| 1697 | 121.666 |
| 1698 | 120.666 |
| 1699 | 119.666 |
| 1700 | 123.096 |
| 1701 | 122.096 |
| 1702 | 121.096 |
| 1703 | 120.096 |
| 1704 | 119.096 |
| 1705 | 122.326 |
| 1706 | 121.326 |
| 1707 | 120.326 |
| 1708 | 119.326 |
| 1709 | 118.326 |
| 1710 | 120.726 |
| 1711 | 119.726 |
| 1712 | 122.226 |
| 1713 | 125.116 |
| 1714 | 124.116 |
| 1715 | 123.116 |
| 1716 | 122.116 |
| 1717 | 121.116 |
| 1718 | 120.116 |
| 1719 | 119.116 |
| 1720 | 118.116 |
| 1721 | 117.116 |
| 1722 | 116.116 |
| 1723 | 115.116 |
| 1724 | 118.346 |
| 1725 | 117.346 |
| 1726 | 116.346 |
| 1727 | 119.876 |
| 1728 | 123.016 |
| 1729 | 122.016 |
| 1730 | 121.016 |
| 1731 | 123.666 |
| 1732 | 122.666 |
| 1733 | 121.666 |
| 1734 | 120.666 |
| 1735 | 123.166 |
| 1736 | 122.166 |
| 1737 | 121.166 |
| 1738 | 123.466 |
| 1739 | 127.186 |
| 1740 | 126.186 |
| 1741 | 125.186 |
| 1742 | 124.186 |
| 1743 | 127.326 |
| 1744 | 126.326 |
| 1745 | 125.326 |
| 1746 | 124.326 |
| 1747 | 123.326 |
| 1748 | 125.486 |
| 1749 | 124.486 |
| 1750 | 123.486 |
| 1751 | 122.486 |
| 1752 | 121.486 |
| 1753 | 124.426 |
| 1754 | 123.426 |
| 1755 | 122.426 |
| 1756 | 125.756 |
| 1757 | 129.186 |
| 1758 | 128.186 |
| 1759 | 127.186 |
| 1760 | 130.126 |
| 1761 | 134.536 |
| 1762 | 137.676 |
| 1763 | 136.676 |
| 1764 | 135.676 |
| 1765 | 137.926 |
| 1766 | 136.926 |
| 1767 | 135.926 |
| 1768 | 138.816 |
| 1769 | 137.816 |
| 1770 | 136.816 |
| 1771 | 140.736 |
| 1772 | 139.736 |
| 1773 | 142.966 |
| 1774 | 141.966 |
| 1775 | 140.966 |
| 1776 | 143.856 |
| 1777 | 142.856 |
| 1778 | 141.856 |
| 1779 | 140.856 |
| 1780 | 139.856 |
| 1781 | 138.856 |
| 1782 | 137.856 |
| 1783 | 136.856 |
| 1784 | 139.256 |
| 1785 | 138.256 |
| 1786 | 137.256 |
| 1787 | 139.556 |
| 1788 | 138.556 |
| 1789 | 137.556 |
| 1790 | 142.456 |
| 1791 | 144.906 |
| 1792 | 143.906 |
| 1793 | 142.906 |
| 1794 | 141.906 |
| 1795 | 140.906 |
| 1796 | 139.906 |
| 1797 | 138.906 |
| 1798 | 137.906 |
| 1799 | 140.646 |
| 1800 | 143.246 |
| 1801 | 142.246 |
| 1802 | 141.246 |
| 1803 | 144.186 |
| 1804 | 143.186 |
| 1805 | 142.186 |
| 1806 | 141.186 |
| 1807 | 143.976 |
| 1808 | 146.816 |
| 1809 | 149.316 |
| 1810 | 152.006 |
| 1811 | 153.966 |
| 1812 | 152.966 |
| 1813 | 151.966 |
| 1814 | 150.966 |
| 1815 | 149.966 |
| 1816 | 148.966 |
| 1817 | 147.966 |
| 1818 | 151.106 |
| 1819 | 150.106 |
| 1820 | 149.106 |
| 1821 | 148.106 |
| 1822 | 147.106 |
| 1823 | 146.106 |
| 1824 | 145.106 |
| 1825 | 144.106 |
| 1826 | 143.106 |
| 1827 | 142.106 |
| 1828 | 141.106 |
| 1829 | 140.106 |
| 1830 | 139.106 |
| 1831 | 141.166 |
| 1832 | 140.166 |
| 1833 | 139.166 |
| 1834 | 138.166 |
| 1835 | 137.166 |
| 1836 | 136.166 |
| 1837 | 135.166 |
| 1838 | 134.166 |
| 1839 | 133.166 |
| 1840 | 132.166 |
| 1841 | 134.326 |
| 1842 | 133.326 |
| 1843 | 132.326 |
| 1844 | 134.626 |
| 1845 | 133.626 |
| 1846 | 132.626 |
| 1847 | 131.626 |
| 1848 | 130.626 |
| 1849 | 129.626 |
| 1850 | 128.626 |
| 1851 | 130.926 |
| 1852 | 129.926 |
| 1853 | 132.226 |
| 1854 | 135.756 |
| 1855 | 134.756 |
| 1856 | 133.756 |
| 1857 | 136.446 |
| 1858 | 135.446 |
| 1859 | 134.446 |
| 1860 | 133.446 |
| 1861 | 132.446 |
| 1862 | 131.446 |
| 1863 | 130.446 |
| 1864 | 129.446 |
| 1865 | 128.446 |
| 1866 | 127.446 |
| 1867 | 130.776 |
| 1868 | 129.776 |
| 1869 | 128.776 |
| 1870 | 127.776 |
| 1871 | 126.776 |
| 1872 | 130.006 |
| 1873 | 133.046 |
| 1874 | 132.046 |
| 1875 | 131.046 |
| 1876 | 130.046 |
| 1877 | 129.046 |
| 1878 | 128.046 |
| 1879 | 127.046 |
| 1880 | 126.046 |
| 1881 | 125.046 |
| 1882 | 127.296 |
| 1883 | 126.296 |
| 1884 | 129.086 |
| 1885 | 132.316 |
| 1886 | 131.316 |
| 1887 | 130.316 |
| 1888 | 129.316 |
| 1889 | 128.316 |
| 1890 | 127.316 |
| 1891 | 129.616 |
| 1892 | 128.616 |
| 1893 | 127.616 |
| 1894 | 126.616 |
| 1895 | 125.616 |
| 1896 | 124.616 |
| 1897 | 123.616 |
| 1898 | 122.616 |
| 1899 | 121.616 |
| 1900 | 120.616 |
| 1901 | 119.616 |
| 1902 | 118.616 |
| 1903 | 117.616 |
| 1904 | 122.316 |
| 1905 | 121.316 |
| 1906 | 123.666 |
| 1907 | 122.666 |
| 1908 | 125.996 |
| 1909 | 129.326 |
| 1910 | 131.386 |
| 1911 | 134.816 |
| 1912 | 133.816 |
| 1913 | 136.266 |
| 1914 | 138.516 |
| 1915 | 140.916 |
| 1916 | 139.916 |
| 1917 | 141.976 |
| 1918 | 140.976 |
| 1919 | 139.976 |
| 1920 | 138.976 |
| 1921 | 137.976 |
| 1922 | 136.976 |
| 1923 | 139.626 |
| 1924 | 138.626 |
| 1925 | 137.626 |
| 1926 | 136.626 |
| 1927 | 135.626 |
| 1928 | 134.626 |
| 1929 | 133.626 |
| 1930 | 132.626 |
| 1931 | 134.876 |
| 1932 | 133.876 |
| 1933 | 132.876 |
| 1934 | 131.876 |
| 1935 | 130.876 |
| 1936 | 129.876 |
| 1937 | 128.876 |
| 1938 | 127.876 |
| 1939 | 131.206 |
| 1940 | 130.206 |
| 1941 | 133.736 |
| 1942 | 132.736 |
| 1943 | 131.736 |
| 1944 | 130.736 |
| 1945 | 133.036 |
| 1946 | 132.036 |
| 1947 | 131.036 |
| 1948 | 130.036 |
| 1949 | 129.036 |
| 1950 | 131.686 |
| 1951 | 130.686 |
| 1952 | 129.686 |
| 1953 | 128.686 |
| 1954 | 127.686 |
| 1955 | 126.686 |
| 1956 | 125.686 |
| 1957 | 124.686 |
| 1958 | 129.096 |
| 1959 | 128.096 |
| 1960 | 127.096 |
| 1961 | 129.296 |
| 1962 | 128.296 |
| 1963 | 127.296 |
| 1964 | 126.296 |
| 1965 | 130.806 |
| 1966 | 129.806 |
| 1967 | 128.806 |
| 1968 | 127.806 |
| 1969 | 130.006 |
| 1970 | 129.006 |
| 1971 | 128.006 |
| 1972 | 127.006 |
| 1973 | 126.006 |
| 1974 | 125.006 |
| 1975 | 127.506 |
| 1976 | 126.506 |
| 1977 | 125.506 |
| 1978 | 129.136 |
| 1979 | 128.136 |
| 1980 | 127.136 |
| 1981 | 126.136 |
| 1982 | 125.136 |
| 1983 | 124.136 |
| 1984 | 123.136 |
| 1985 | 122.136 |
| 1986 | 121.136 |
| 1987 | 120.136 |
| 1988 | 119.136 |
| 1989 | 118.136 |
| 1990 | 117.136 |
| 1991 | 119.096 |
| 1992 | 118.096 |
| 1993 | 117.096 |
| 1994 | 116.096 |
| 1995 | 115.096 |
| 1996 | 114.096 |
| 1997 | 116.496 |
| 1998 | 118.456 |
| 1999 | 120.656 |
| 2000 | 119.656 |
| 2001 | 118.656 |
| 2002 | 117.656 |
| 2003 | 119.816 |
| 2004 | 122.266 |
| 2005 | 121.266 |
| 2006 | 124.206 |
| 2007 | 126.806 |
| 2008 | 128.966 |
| 2009 | 127.966 |
| 2010 | 126.966 |
| 2011 | 129.126 |
| 2012 | 131.816 |
| 2013 | 130.816 |
| 2014 | 129.816 |
| 2015 | 128.816 |
| 2016 | 127.816 |
| 2017 | 126.816 |
| 2018 | 130.346 |